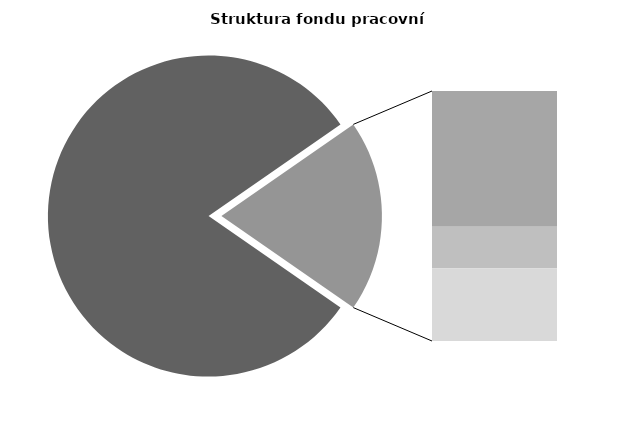
| Category | Series 0 |
|---|---|
| Průměrná měsíční odpracovaná doba bez přesčasu | 138.473 |
| Dovolená | 18.021 |
| Nemoc | 5.51 |
| Jiné | 9.637 |